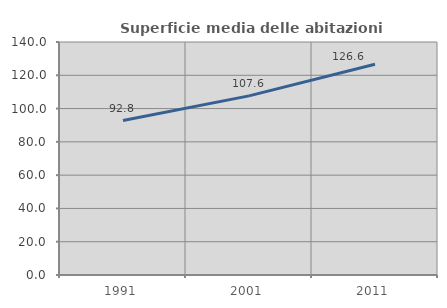
| Category | Superficie media delle abitazioni occupate |
|---|---|
| 1991.0 | 92.809 |
| 2001.0 | 107.642 |
| 2011.0 | 126.616 |